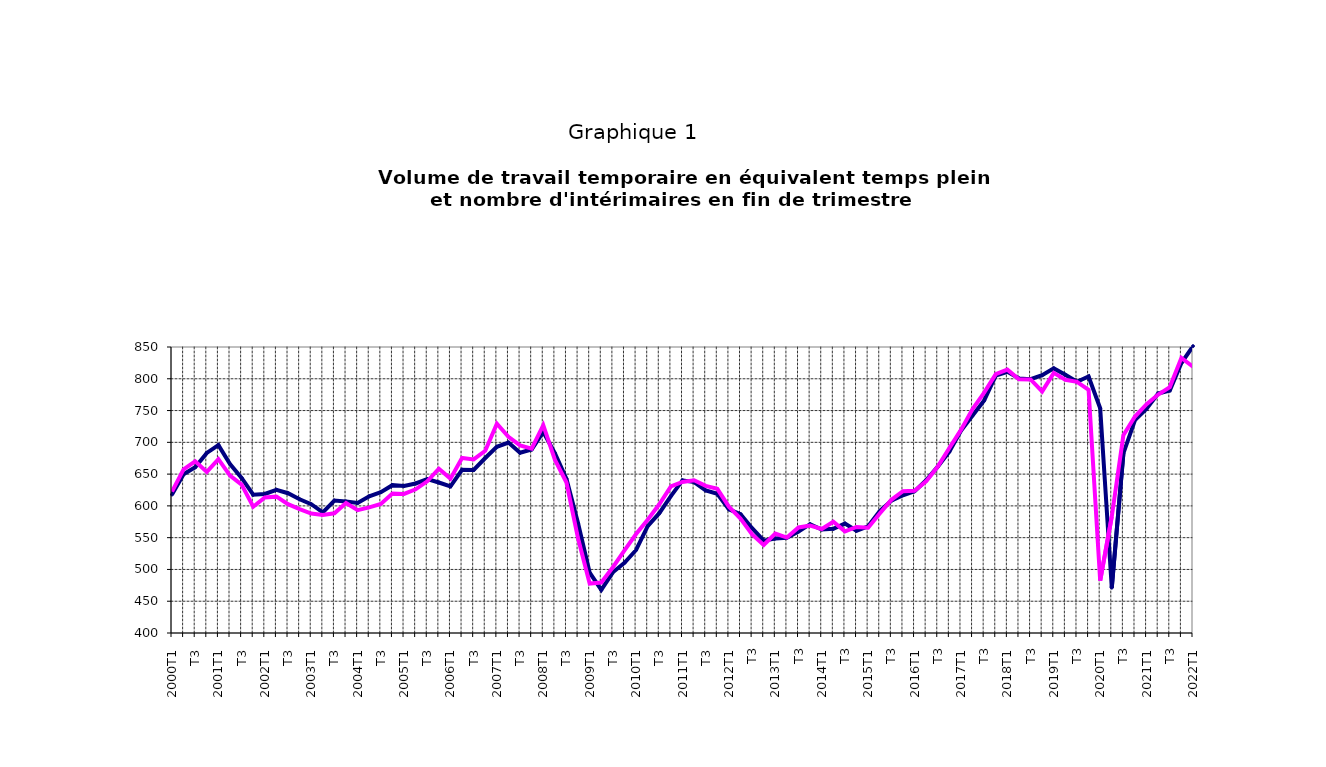
| Category | EETP | int |
|---|---|---|
| 2000T1 | 617.928 | 622.594 |
|      T2 | 649.685 | 657.411 |
|      T3 | 660.748 | 670.235 |
|      T4 | 683.382 | 653.452 |
| 2001T1 | 695.644 | 673.54 |
|      T2 | 665.892 | 647.568 |
|      T3 | 644.021 | 633.511 |
|      T4 | 617.518 | 598.655 |
| 2002T1 | 618.74 | 613.226 |
|      T2 | 625.389 | 614.538 |
|      T3 | 619.926 | 602.771 |
|      T4 | 610.417 | 594.948 |
| 2003T1 | 602.617 | 587.88 |
|      T2 | 589.782 | 585.855 |
|      T3 | 608.407 | 588.311 |
|      T4 | 606.755 | 604.404 |
| 2004T1 | 604.523 | 593.289 |
|      T2 | 615.105 | 597.707 |
|      T3 | 621.636 | 603.032 |
|      T4 | 632.613 | 619.458 |
| 2005T1 | 631.407 | 618.799 |
|      T2 | 635.237 | 626.101 |
|      T3 | 642.007 | 638.721 |
|      T4 | 636.81 | 658.508 |
| 2006T1 | 630.691 | 642.896 |
|      T2 | 656.875 | 675.389 |
|      T3 | 656.485 | 673.041 |
|      T4 | 675.337 | 686.787 |
| 2007T1 | 693.039 | 729.471 |
|      T2 | 699.736 | 708.656 |
|      T3 | 683.547 | 695.265 |
|      T4 | 688.695 | 690.036 |
| 2008T1 | 716.252 | 726.971 |
|      T2 | 683.02 | 672.678 |
|      T3 | 642.529 | 636.835 |
|      T4 | 572.714 | 548.528 |
| 2009T1 | 494.911 | 477.746 |
|      T2 | 467.728 | 479.358 |
|      T3 | 495.489 | 503.51 |
|      T4 | 510.529 | 529.932 |
| 2010T1 | 530.625 | 555.728 |
|      T2 | 568.029 | 578.294 |
|      T3 | 588.512 | 602.513 |
|      T4 | 615.291 | 630.776 |
| 2011T1 | 640.182 | 637.615 |
|      T2 | 637.433 | 640.323 |
|      T3 | 624.258 | 631.492 |
|      T4 | 618.977 | 626.888 |
| 2012T1 | 594.639 | 598.81 |
|      T2 | 587.088 | 579.966 |
| T3 | 564.945 | 554.967 |
| T4 | 545.324 | 538.451 |
| 2013T1 | 548.735 | 556.447 |
| T2 | 549.996 | 550.114 |
| T3 | 559.572 | 566.087 |
| T4 | 571.211 | 569.017 |
| 2014T1 | 562.887 | 563.7 |
| T2 | 563.851 | 574.967 |
| T3 | 572.176 | 559.871 |
| T4 | 561.02 | 566.825 |
| 2015T1 | 567.833 | 565.678 |
| T2 | 591.737 | 587.997 |
| T3 | 608.005 | 609.521 |
| T4 | 616.725 | 623.202 |
| 2016T1 | 622.905 | 623.921 |
| T2 | 640.335 | 638.57 |
| T3 | 661.743 | 661.885 |
| T4 | 685.165 | 691.138 |
| 2017T1 | 718.279 | 719.508 |
| T2 | 742.141 | 752.469 |
| T3 | 765.999 | 778.147 |
| T4 | 804.921 | 807.211 |
| 2018T1 | 810.929 | 814.436 |
| T2 | 800.614 | 799.339 |
| T3 | 799.266 | 799.055 |
| T4 | 805.54 | 780.096 |
| 2019T1 | 816.355 | 809.286 |
| T2 | 806.359 | 798.384 |
| T3 | 795.238 | 795.143 |
| T4 | 803.65 | 782.716 |
| 2020T1 | 753.633 | 482.405 |
| T2 | 471.374 | 583.251 |
| T3 | 682.594 | 711.26 |
| T4 | 734.851 | 740.617 |
| 2021T1 | 752.887 | 760.106 |
| T2 | 776.91 | 775.247 |
| T3 | 781.63 | 786.962 |
| T4 | 824.788 | 832.911 |
| 2022T1 | 851.345 | 819.09 |